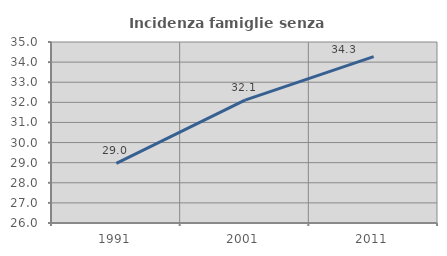
| Category | Incidenza famiglie senza nuclei |
|---|---|
| 1991.0 | 28.963 |
| 2001.0 | 32.111 |
| 2011.0 | 34.274 |